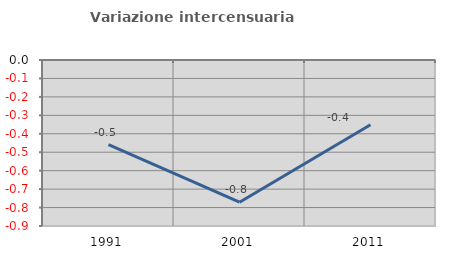
| Category | Variazione intercensuaria annua |
|---|---|
| 1991.0 | -0.459 |
| 2001.0 | -0.771 |
| 2011.0 | -0.351 |